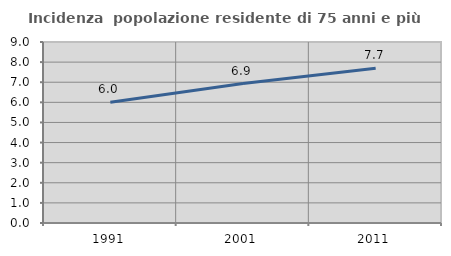
| Category | Incidenza  popolazione residente di 75 anni e più |
|---|---|
| 1991.0 | 6.008 |
| 2001.0 | 6.933 |
| 2011.0 | 7.692 |